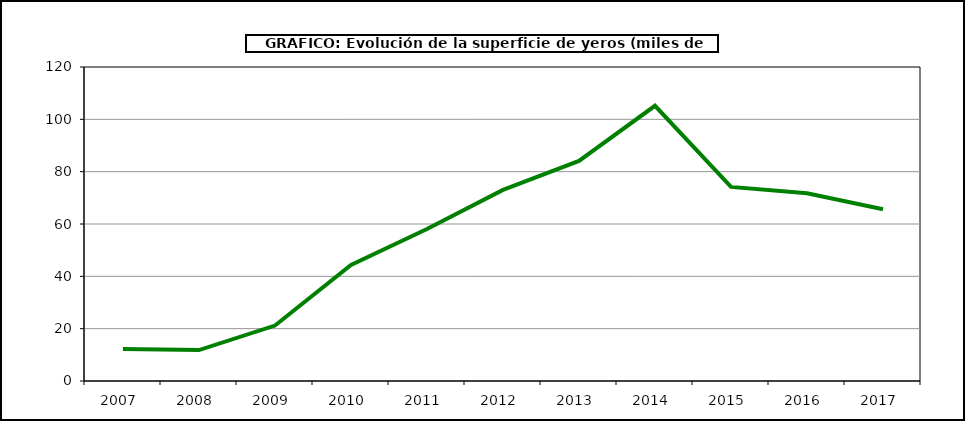
| Category | Superficie |
|---|---|
| 2007.0 | 12.276 |
| 2008.0 | 11.807 |
| 2009.0 | 21.198 |
| 2010.0 | 44.369 |
| 2011.0 | 58.104 |
| 2012.0 | 73.051 |
| 2013.0 | 84.103 |
| 2014.0 | 105.185 |
| 2015.0 | 74.162 |
| 2016.0 | 71.777 |
| 2017.0 | 65.659 |